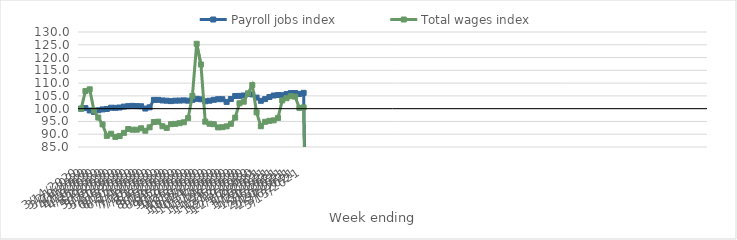
| Category | Payroll jobs index | Total wages index |
|---|---|---|
| 14/03/2020 | 100 | 100 |
| 21/03/2020 | 100.212 | 106.878 |
| 28/03/2020 | 99.292 | 107.576 |
| 04/04/2020 | 98.745 | 99.264 |
| 11/04/2020 | 99.378 | 96.525 |
| 18/04/2020 | 99.708 | 93.836 |
| 25/04/2020 | 99.876 | 89.345 |
| 02/05/2020 | 100.366 | 90.19 |
| 09/05/2020 | 100.326 | 88.95 |
| 16/05/2020 | 100.449 | 89.297 |
| 23/05/2020 | 100.809 | 90.528 |
| 30/05/2020 | 100.985 | 92.028 |
| 06/06/2020 | 101.102 | 91.766 |
| 13/06/2020 | 101.003 | 91.769 |
| 20/06/2020 | 100.94 | 92.33 |
| 27/06/2020 | 100.044 | 91.361 |
| 04/07/2020 | 100.525 | 92.702 |
| 11/07/2020 | 103.442 | 94.77 |
| 18/07/2020 | 103.439 | 94.916 |
| 25/07/2020 | 103.216 | 93.119 |
| 01/08/2020 | 103.118 | 92.472 |
| 08/08/2020 | 102.962 | 93.938 |
| 15/08/2020 | 103.136 | 94.055 |
| 22/08/2020 | 103.166 | 94.313 |
| 29/08/2020 | 103.247 | 94.67 |
| 05/09/2020 | 103.127 | 96.301 |
| 12/09/2020 | 103.452 | 104.988 |
| 19/09/2020 | 103.846 | 125.389 |
| 26/09/2020 | 103.665 | 117.274 |
| 03/10/2020 | 102.9 | 94.92 |
| 10/10/2020 | 103.116 | 94.097 |
| 17/10/2020 | 103.465 | 93.913 |
| 24/10/2020 | 103.705 | 92.67 |
| 31/10/2020 | 103.708 | 92.752 |
| 07/11/2020 | 102.647 | 93.082 |
| 14/11/2020 | 103.765 | 94.07 |
| 21/11/2020 | 104.961 | 96.498 |
| 28/11/2020 | 105.006 | 102.115 |
| 05/12/2020 | 105.156 | 102.724 |
| 12/12/2020 | 105.774 | 105.978 |
| 19/12/2020 | 105.582 | 109.234 |
| 26/12/2020 | 104.335 | 98.569 |
| 02/01/2021 | 103.076 | 93.124 |
| 09/01/2021 | 103.736 | 94.868 |
| 16/01/2021 | 104.56 | 95.233 |
| 23/01/2021 | 105.148 | 95.429 |
| 30/01/2021 | 105.328 | 96.371 |
| 06/02/2021 | 105.263 | 103.219 |
| 13/02/2021 | 105.708 | 104.087 |
| 20/02/2021 | 106.092 | 104.869 |
| 27/02/2021 | 106.114 | 104.722 |
| 06/03/2021 | 105.766 | 100.299 |
| 13/03/2021 | 106.194 | 100.487 |